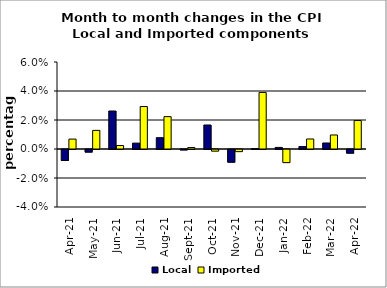
| Category | Local | Imported |
|---|---|---|
| 2021-04-01 | -0.008 | 0.007 |
| 2021-05-01 | -0.002 | 0.013 |
| 2021-06-01 | 0.026 | 0.002 |
| 2021-07-01 | 0.004 | 0.029 |
| 2021-08-01 | 0.008 | 0.022 |
| 2021-09-01 | 0 | 0.001 |
| 2021-10-01 | 0.017 | -0.001 |
| 2021-11-01 | -0.009 | -0.001 |
| 2021-12-01 | 0 | 0.039 |
| 2022-01-01 | 0.001 | -0.009 |
| 2022-02-01 | 0.002 | 0.007 |
| 2022-03-01 | 0.004 | 0.01 |
| 2022-04-01 | -0.003 | 0.02 |